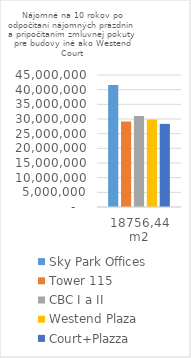
| Category | Sky Park Offices | Tower 115 | CBC I a II | Westend Plaza | Court+Plazza |
|---|---|---|---|---|---|
| 18756,44 m2 | 41604877.91 | 29167358.376 | 31018038.254 | 29856094.852 | 28334980.742 |